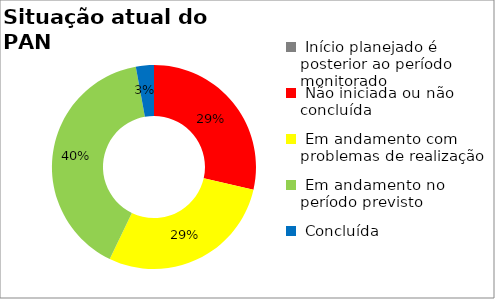
| Category | Series 0 |
|---|---|
|  Início planejado é posterior ao período monitorado | 0 |
|  Não iniciada ou não concluída | 0.286 |
|  Em andamento com problemas de realização | 0.286 |
|  Em andamento no período previsto  | 0.4 |
|  Concluída | 0.029 |